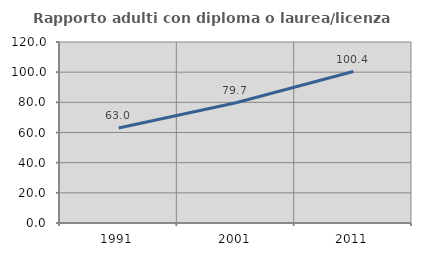
| Category | Rapporto adulti con diploma o laurea/licenza media  |
|---|---|
| 1991.0 | 63.018 |
| 2001.0 | 79.741 |
| 2011.0 | 100.424 |